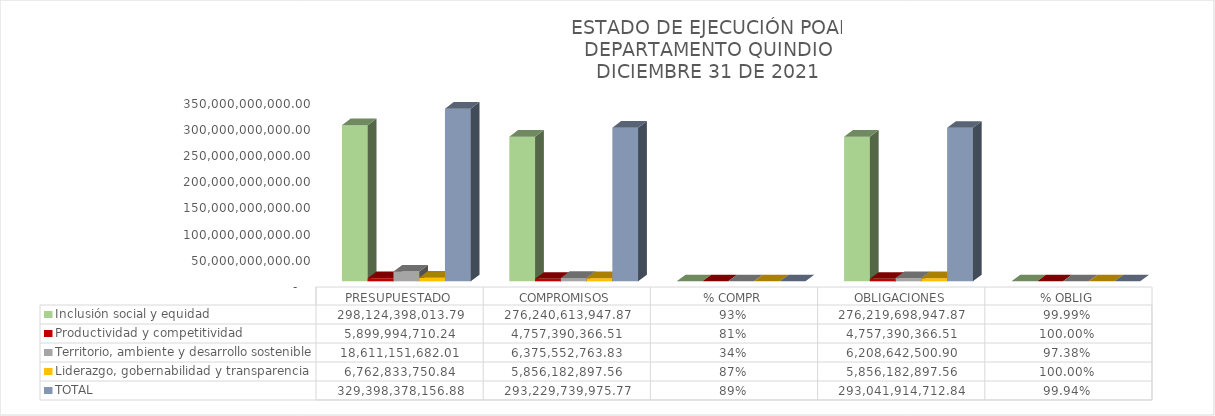
| Category | Inclusión social y equidad | Productividad y competitividad | Territorio, ambiente y desarrollo sostenible | Liderazgo, gobernabilidad y transparencia | TOTAL |
|---|---|---|---|---|---|
|  PRESUPUESTADO  | 298124398013.79 | 5899994710.24 | 18611151682.01 | 6762833750.84 | 329398378156.88 |
|  COMPROMISOS  | 276240613947.87 | 4757390366.51 | 6375552763.834 | 5856182897.56 | 293229739975.774 |
|  % COMPR  | 0.927 | 0.806 | 0.343 | 0.866 | 0.89 |
|  OBLIGACIONES  | 276219698947.87 | 4757390366.51 | 6208642500.903 | 5856182897.56 | 293041914712.843 |
|  % OBLIG  | 1 | 1 | 0.974 | 1 | 0.999 |